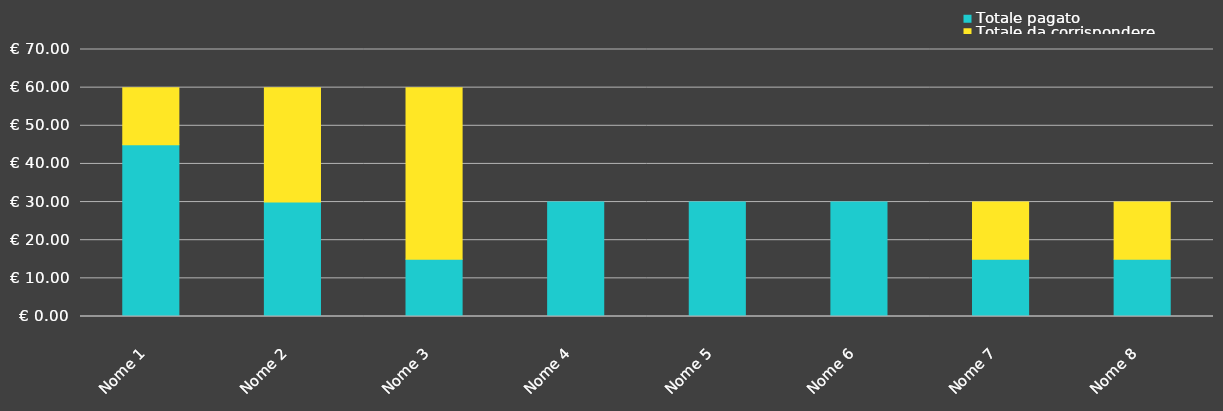
| Category | Totale pagato | Totale da corrispondere |
|---|---|---|
| Nome 1 | 45 | 15 |
| Nome 2 | 30 | 30 |
| Nome 3 | 15 | 45 |
| Nome 4 | 30 | 0 |
| Nome 5 | 30 | 0 |
| Nome 6 | 30 | 0 |
| Nome 7 | 15 | 15 |
| Nome 8 | 15 | 15 |